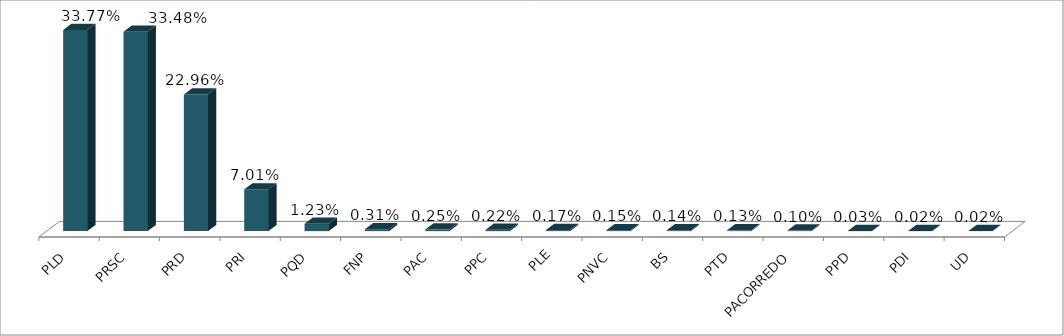
| Category | Votos % |
|---|---|
| PLD | 0.338 |
| PRSC | 0.335 |
| PRD | 0.23 |
| PRI | 0.07 |
| PQD | 0.012 |
| FNP | 0.003 |
| PAC | 0.003 |
| PPC | 0.002 |
| PLE | 0.002 |
| PNVC | 0.002 |
| BS | 0.001 |
| PTD | 0.001 |
| PACORREDO | 0.001 |
| PPD | 0 |
| PDI | 0 |
| UD | 0 |